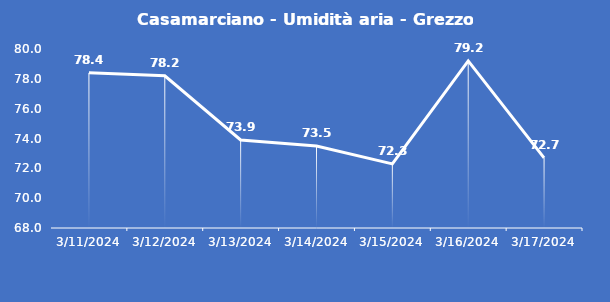
| Category | Casamarciano - Umidità aria - Grezzo (%) |
|---|---|
| 3/11/24 | 78.4 |
| 3/12/24 | 78.2 |
| 3/13/24 | 73.9 |
| 3/14/24 | 73.5 |
| 3/15/24 | 72.3 |
| 3/16/24 | 79.2 |
| 3/17/24 | 72.7 |